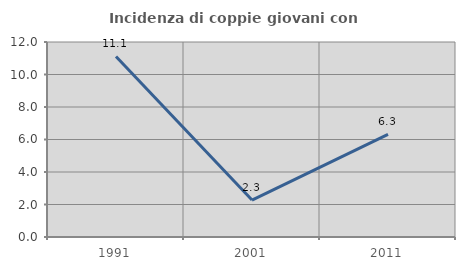
| Category | Incidenza di coppie giovani con figli |
|---|---|
| 1991.0 | 11.111 |
| 2001.0 | 2.273 |
| 2011.0 | 6.316 |